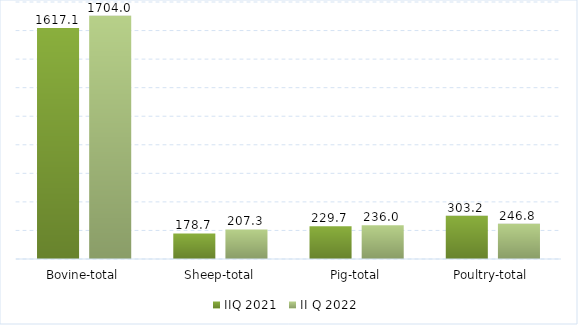
| Category | IIQ 2021 | II Q 2022 |
|---|---|---|
| Bovine-total | 1617.1 | 1704 |
| Sheep-total | 178.7 | 207.3 |
| Pig-total | 229.7 | 236 |
| Poultry-total | 303.2 | 246.8 |